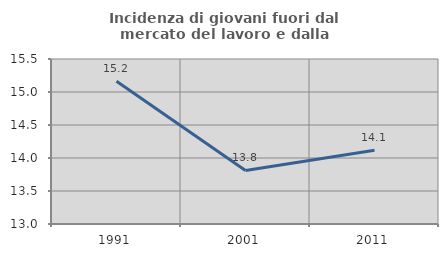
| Category | Incidenza di giovani fuori dal mercato del lavoro e dalla formazione  |
|---|---|
| 1991.0 | 15.163 |
| 2001.0 | 13.811 |
| 2011.0 | 14.119 |